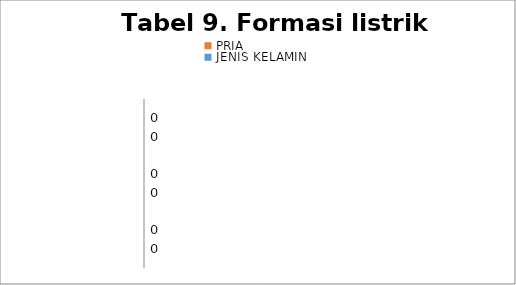
| Category | JENIS KELAMIN | PRIA  |
|---|---|---|
|  | 0 | 0 |
|  | 0 | 0 |
|  | 0 | 0 |